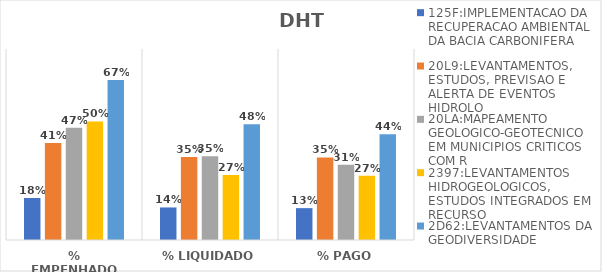
| Category | 125F:IMPLEMENTACAO DA RECUPERACAO AMBIENTAL DA BACIA CARBONIFERA | 20L9:LEVANTAMENTOS, ESTUDOS, PREVISAO E ALERTA DE EVENTOS HIDROLO | 20LA:MAPEAMENTO GEOLOGICO-GEOTECNICO EM MUNICIPIOS CRITICOS COM R | 2397:LEVANTAMENTOS HIDROGEOLOGICOS, ESTUDOS INTEGRADOS EM RECURSO | 2D62:LEVANTAMENTOS DA GEODIVERSIDADE |
|---|---|---|---|---|---|
| % EMPENHADO | 0.176 | 0.406 | 0.471 | 0.497 | 0.67 |
| % LIQUIDADO | 0.136 | 0.348 | 0.351 | 0.272 | 0.485 |
| % PAGO | 0.133 | 0.346 | 0.315 | 0.269 | 0.443 |